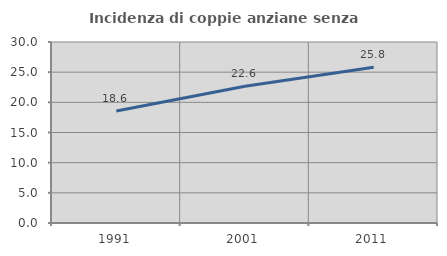
| Category | Incidenza di coppie anziane senza figli  |
|---|---|
| 1991.0 | 18.561 |
| 2001.0 | 22.65 |
| 2011.0 | 25.822 |